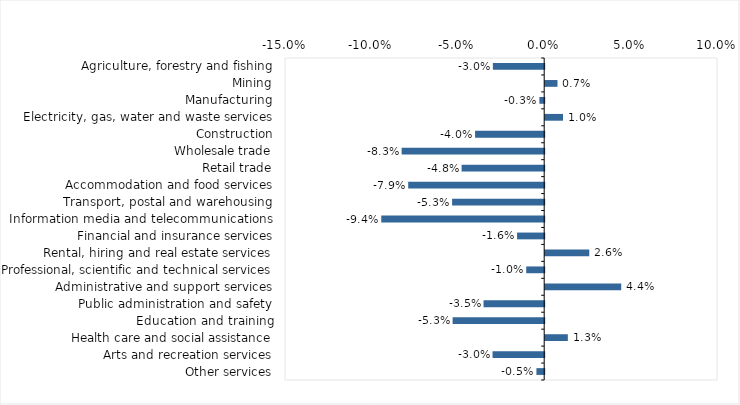
| Category | This week |
|---|---|
| Agriculture, forestry and fishing | -0.03 |
| Mining | 0.007 |
| Manufacturing | -0.003 |
| Electricity, gas, water and waste services | 0.01 |
| Construction | -0.04 |
| Wholesale trade | -0.082 |
| Retail trade | -0.048 |
| Accommodation and food services | -0.079 |
| Transport, postal and warehousing | -0.053 |
| Information media and telecommunications | -0.094 |
| Financial and insurance services | -0.016 |
| Rental, hiring and real estate services | 0.026 |
| Professional, scientific and technical services | -0.01 |
| Administrative and support services | 0.044 |
| Public administration and safety | -0.035 |
| Education and training | -0.053 |
| Health care and social assistance | 0.013 |
| Arts and recreation services | -0.03 |
| Other services | -0.004 |